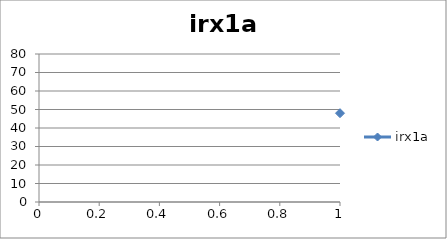
| Category | irx1a |
|---|---|
| 0 | 48 |
| 1 | 73 |
| 2 | 64 |
| 3 | 6 |
| 4 | 52 |
| 5 | 8 |
| 6 | 30 |
| 7 | 3 |
| 8 | 24 |
| 9 | 22 |
| 10 | 18 |